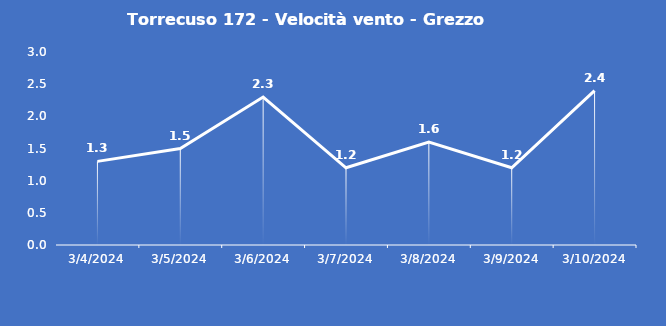
| Category | Torrecuso 172 - Velocità vento - Grezzo (m/s) |
|---|---|
| 3/4/24 | 1.3 |
| 3/5/24 | 1.5 |
| 3/6/24 | 2.3 |
| 3/7/24 | 1.2 |
| 3/8/24 | 1.6 |
| 3/9/24 | 1.2 |
| 3/10/24 | 2.4 |